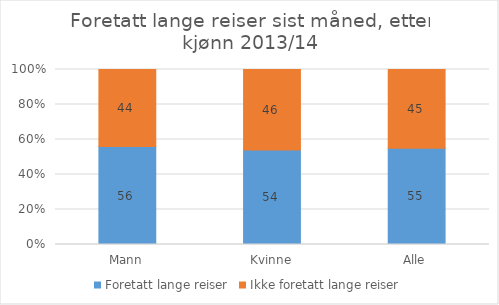
| Category | Foretatt lange reiser | Ikke foretatt lange reiser |
|---|---|---|
| Mann | 56 | 44 |
| Kvinne | 54 | 46 |
| Alle | 55 | 45 |